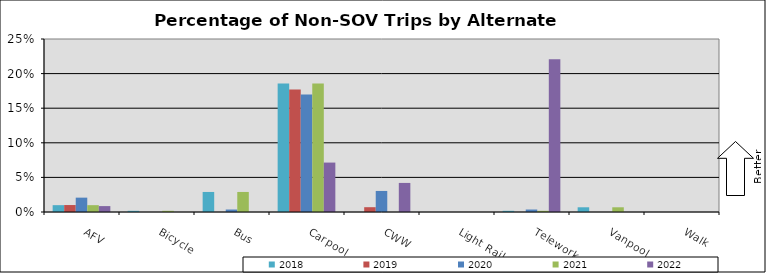
| Category | 2018 | 2019 | 2020 | 2021 | 2022 |
|---|---|---|---|---|---|
| AFV | 0.01 | 0.01 | 0.021 | 0.01 | 0.009 |
| Bicycle | 0.002 | 0 | 0 | 0.002 | 0 |
| Bus | 0.029 | 0 | 0.004 | 0.029 | 0 |
| Carpool | 0.186 | 0.177 | 0.17 | 0.186 | 0.071 |
| CWW | 0 | 0.007 | 0.03 | 0 | 0.042 |
| Light Rail | 0 | 0 | 0 | 0 | 0 |
| Telework | 0.002 | 0 | 0.004 | 0.002 | 0.221 |
| Vanpool | 0.007 | 0 | 0 | 0.007 | 0 |
| Walk | 0 | 0 | 0 | 0 | 0 |